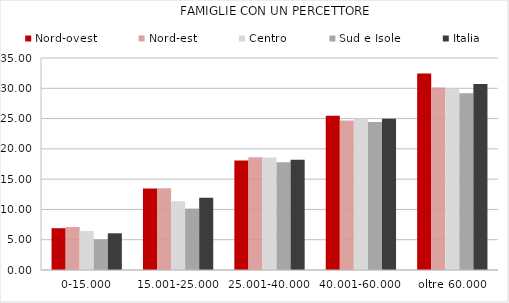
| Category | Nord-ovest | Nord-est | Centro | Sud e Isole | Italia |
|---|---|---|---|---|---|
| 0-15.000 | 6.9 | 7.1 | 6.44 | 5.06 | 6.06 |
| 15.001-25.000 | 13.46 | 13.48 | 11.35 | 10.13 | 11.94 |
| 25.001-40.000 | 18.06 | 18.61 | 18.57 | 17.77 | 18.19 |
| 40.001-60.000 | 25.45 | 24.7 | 25.02 | 24.43 | 24.97 |
| oltre 60.000 | 32.46 | 30.11 | 29.87 | 29.18 | 30.71 |